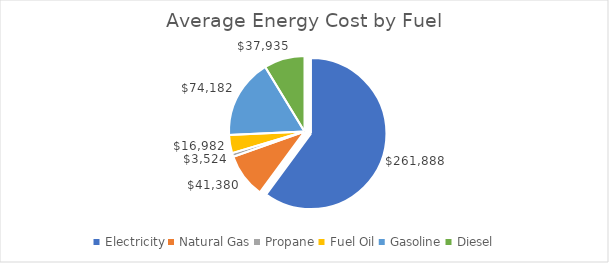
| Category | Series 4 |
|---|---|
| Electricity | 261888.075 |
| Natural Gas | 41379.605 |
| Propane | 3523.68 |
| Fuel Oil | 16982.255 |
| Gasoline | 74181.94 |
| Diesel | 37934.61 |